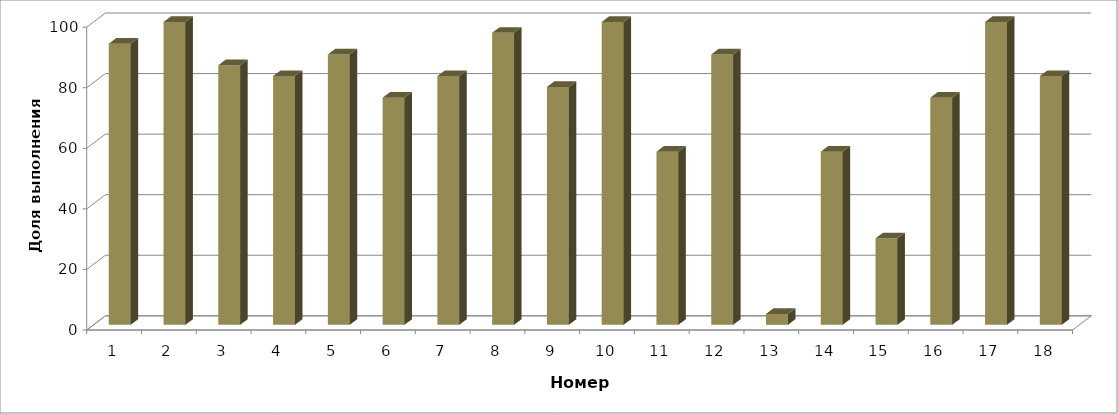
| Category | Доля учащихся полностьювы полнивших задание |
|---|---|
| 1.0 | 92.857 |
| 2.0 | 100 |
| 3.0 | 85.714 |
| 4.0 | 82.143 |
| 5.0 | 89.286 |
| 6.0 | 75 |
| 7.0 | 82.143 |
| 8.0 | 96.429 |
| 9.0 | 78.571 |
| 10.0 | 100 |
| 11.0 | 57.143 |
| 12.0 | 89.286 |
| 13.0 | 3.571 |
| 14.0 | 57.143 |
| 15.0 | 28.571 |
| 16.0 | 75 |
| 17.0 | 100 |
| 18.0 | 82.143 |